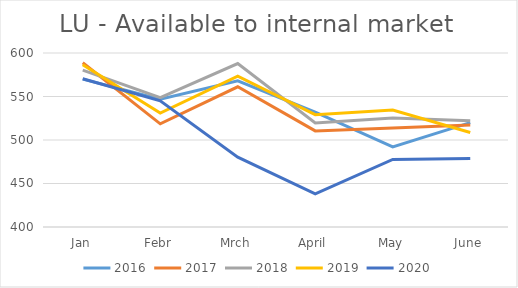
| Category | 2016 | 2017 | 2018 | 2019 | 2020 |
|---|---|---|---|---|---|
| Jan | 570 | 588.741 | 580.392 | 586.496 | 570.33 |
| Febr | 547 | 518.557 | 548.724 | 530.944 | 544.994 |
| Mrch | 568 | 561.178 | 587.889 | 573.391 | 480.297 |
| April | 532 | 510.459 | 519.675 | 529.107 | 438.127 |
| May | 492 | 513.683 | 525.205 | 534.385 | 477.715 |
| June | 520 | 517.36 | 522.173 | 508.669 | 478.657 |